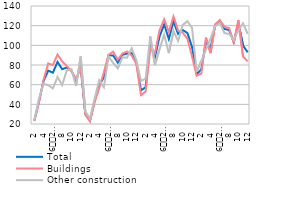
| Category | Total | Buildings  | Other construction |
|---|---|---|---|
| 2 | 23.36 | 23.176 | 23.734 |
| 3 | 43.009 | 41.634 | 45.802 |
| 4 | 63.758 | 65.22 | 60.791 |
| 5 | 74.339 | 81.627 | 59.542 |
| 6
2015 | 72.14 | 79.986 | 56.211 |
| 7 | 83.133 | 90.651 | 67.87 |
| 8 | 75.713 | 83.678 | 59.542 |
| 9 | 77.499 | 78.961 | 74.532 |
| 10 | 74.339 | 73.628 | 75.781 |
| 11 | 63.483 | 65.835 | 58.709 |
| 12 | 80.385 | 76.295 | 88.688 |
| 1
2016 | 30.505 | 29.328 | 32.894 |
| 2
 | 23.497 | 22.56 | 25.399 |
| 3 | 43.422 | 42.249 | 45.802 |
| 4 | 59.361 | 56.811 | 64.539 |
| 5 | 67.606 | 72.603 | 57.46 |
| 6
2016 | 89.866 | 90.446 | 88.688 |
| 7 | 89.729 | 93.522 | 82.026 |
| 8 | 82.446 | 85.319 | 76.613 |
| 9 | 90.416 | 91.677 | 87.856 |
| 10 | 91.652 | 93.728 | 87.439 |
| 11 | 92.065 | 89.626 | 97.016 |
| 12 | 82.446 | 81.217 | 84.941 |
| 1
2017 | 54.139 | 49.427 | 63.706 |
| 2 | 57.437 | 53.119 | 66.204 |
| 3 | 101.271 | 97.419 | 109.091 |
| 4 | 87.942 | 91.882 | 79.944 |
| 5 | 108.966 | 115.262 | 96.183 |
| 6
2017 | 121.333 | 126.542 | 110.756 |
| 7 | 106.355 | 113.417 | 92.019 |
| 8 | 124.493 | 129.414 | 114.504 |
| 9 | 111.577 | 115.057 | 104.511 |
| 10 | 115.562 | 113.006 | 120.749 |
| 11 | 112.539 | 106.648 | 124.497 |
| 12 | 98.385 | 88.805 | 117.835 |
| 1
2018 | 70.491 | 69.116 | 73.282 |
| 2
 | 75.575 | 71.372 | 84.108 |
| 3 | 103.744 | 107.879 | 95.35 |
| 4 | 97.011 | 92.087 | 107.009 |
| 5 | 120.783 | 121.415 | 119.5 |
| 6
2018 | 124.768 | 125.722 | 122.831 |
| 7 | 116.661 | 118.749 | 112.422 |
| 8 | 115.562 | 117.518 | 111.589 |
| 9 | 103.332 | 102.341 | 105.344 |
| 10 | 122.157 | 125.517 | 115.3 |
| 11 | 99.76 | 88.6 | 122.4 |
| 12 | 92.889 | 83.678 | 111.589 |